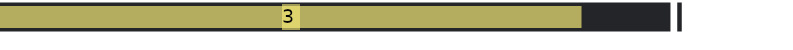
| Category | Ziel  Abnahme | Ist Gewicht |
|---|---|---|
| 0 | 3.5 | 3 |